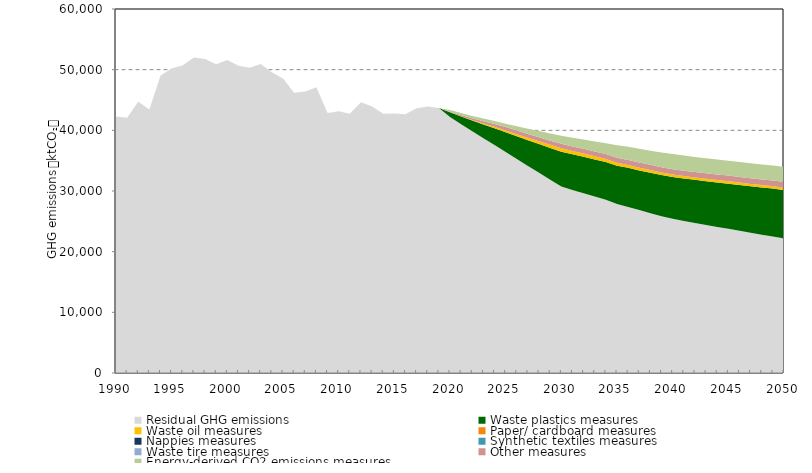
| Category | Residual GHG emissions | Waste plastics measures | Waste oil measures | Paper/ cardboard measures | Nappies measures | Synthetic textiles measures | Waste tire measures | Other measures | Energy-derived CO2 emissions measures |
|---|---|---|---|---|---|---|---|---|---|
| 1990.0 | 42266.328 | 0 | 0 | 0 | 0 | 0 | 0 | 0 | 0 |
| 1991.0 | 42068.039 | 0 | 0 | 0 | 0 | 0 | 0 | 0 | 0 |
| 1992.0 | 44731.649 | 0 | 0 | 0 | 0 | 0 | 0 | 0 | 0 |
| 1993.0 | 43428.344 | 0 | 0 | 0 | 0 | 0 | 0 | 0 | 0 |
| 1994.0 | 49054.209 | 0 | 0 | 0 | 0 | 0 | 0 | 0 | 0 |
| 1995.0 | 50185.134 | 0 | 0 | 0 | 0 | 0 | 0 | 0 | 0 |
| 1996.0 | 50738.328 | 0 | 0 | 0 | 0 | 0 | 0 | 0 | 0 |
| 1997.0 | 51995.071 | 0 | 0 | 0 | 0 | 0 | 0 | 0 | 0 |
| 1998.0 | 51748.919 | 0 | 0 | 0 | 0 | 0 | 0 | 0 | 0 |
| 1999.0 | 50913.17 | 0 | 0 | 0 | 0 | 0 | 0 | 0 | 0 |
| 2000.0 | 51605.471 | 0 | 0 | 0 | 0 | 0 | 0 | 0 | 0 |
| 2001.0 | 50655.519 | 0 | 0 | 0 | 0 | 0 | 0 | 0 | 0 |
| 2002.0 | 50310.327 | 0 | 0 | 0 | 0 | 0 | 0 | 0 | 0 |
| 2003.0 | 50923.046 | 0 | 0 | 0 | 0 | 0 | 0 | 0 | 0 |
| 2004.0 | 49561.224 | 0 | 0 | 0 | 0 | 0 | 0 | 0 | 0 |
| 2005.0 | 48535.509 | 0 | 0 | 0 | 0 | 0 | 0 | 0 | 0 |
| 2006.0 | 46186.191 | 0 | 0 | 0 | 0 | 0 | 0 | 0 | 0 |
| 2007.0 | 46417.888 | 0 | 0 | 0 | 0 | 0 | 0 | 0 | 0 |
| 2008.0 | 47090.333 | 0 | 0 | 0 | 0 | 0 | 0 | 0 | 0 |
| 2009.0 | 42840.145 | 0 | 0 | 0 | 0 | 0 | 0 | 0 | 0 |
| 2010.0 | 43141.105 | 0 | 0 | 0 | 0 | 0 | 0 | 0 | 0 |
| 2011.0 | 42732.48 | 0 | 0 | 0 | 0 | 0 | 0 | 0 | 0 |
| 2012.0 | 44630.65 | 0 | 0 | 0 | 0 | 0 | 0 | 0 | 0 |
| 2013.0 | 43911.198 | 0 | 0 | 0 | 0 | 0 | 0 | 0 | 0 |
| 2014.0 | 42717.865 | 0 | 0 | 0 | 0 | 0 | 0 | 0 | 0 |
| 2015.0 | 42794.468 | 0 | 0 | 0 | 0 | 0 | 0 | 0 | 0 |
| 2016.0 | 42653.672 | 0 | 0 | 0 | 0 | 0 | 0 | 0 | 0 |
| 2017.0 | 43637.786 | 0 | 0 | 0 | 0 | 0 | 0 | 0 | 0 |
| 2018.0 | 43948.194 | 0 | 0 | 0 | 0 | 0 | 0 | 0 | 0 |
| 2019.0 | 43693.849 | 0 | 0 | 0 | 0 | 0 | 0 | 0 | 0 |
| 2020.0 | 42217.498 | 758.817 | 2.814 | 0 | 0 | 0 | 0 | 90.971 | 267.931 |
| 2021.0 | 41017.494 | 1255.755 | 57.976 | 0 | 0 | 0 | 0 | 184.335 | 321.705 |
| 2022.0 | 39845.145 | 1764.288 | 113.09 | 0 | 0 | 0 | 0 | 278.646 | 377.282 |
| 2023.0 | 38688.611 | 2271.213 | 170.913 | 0 | 0 | 0 | 0 | 373.814 | 433.736 |
| 2024.0 | 37581.542 | 2777.884 | 225.93 | 0 | 0 | 0 | 0 | 469.398 | 487.854 |
| 2025.0 | 36414.085 | 3281.594 | 283.656 | 0 | 0 | 0 | 0 | 564.999 | 545.64 |
| 2026.0 | 35255.598 | 3771.278 | 338.575 | 0 | 0 | 0 | 0 | 597.932 | 712.208 |
| 2027.0 | 34106.794 | 4260.408 | 396.203 | 0 | 0 | 0 | 0 | 630.25 | 875.266 |
| 2028.0 | 33006.328 | 4750.106 | 451.025 | 0 | 0 | 0 | 0 | 662.032 | 1032.079 |
| 2029.0 | 31864.786 | 5236.711 | 505.799 | 0 | 0 | 0 | 0 | 693.435 | 1184.724 |
| 2030.0 | 30756.901 | 5724.145 | 563.281 | 0 | 0 | 0 | 0 | 724.431 | 1331.509 |
| 2031.0 | 30156.403 | 5897.896 | 547.318 | 0 | 0 | 0 | 0 | 743.648 | 1441.851 |
| 2032.0 | 29633.18 | 6023.629 | 531.307 | 0 | 0 | 0 | 0 | 762.708 | 1554.399 |
| 2033.0 | 29077.544 | 6127.114 | 515.249 | 0 | 0 | 0 | 0 | 781.561 | 1666.43 |
| 2034.0 | 28560.526 | 6224.341 | 499.143 | 0 | 0 | 0 | 0 | 800.214 | 1775.728 |
| 2035.0 | 27857.877 | 6318.837 | 482.99 | 0 | 0 | 0 | 0 | 818.432 | 2077.3 |
| 2036.0 | 27375.107 | 6439.875 | 466.789 | 0 | 0 | 0 | 0 | 835.937 | 2163.042 |
| 2037.0 | 26847.657 | 6552.028 | 450.541 | 0 | 0 | 0 | 0 | 851.258 | 2248.94 |
| 2038.0 | 26350.36 | 6664.38 | 434.245 | 0 | 0 | 0 | 0 | 864.641 | 2336.228 |
| 2039.0 | 25855.09 | 6775.503 | 417.902 | 0 | 0 | 0 | 0 | 876.374 | 2422.199 |
| 2040.0 | 25418.69 | 6887.661 | 401.511 | 0 | 0 | 0 | 0 | 886.701 | 2487.162 |
| 2041.0 | 25061.351 | 6995.595 | 402.17 | 0 | 0 | 0 | 0 | 895.88 | 2480.656 |
| 2042.0 | 24732.637 | 7105.954 | 402.825 | 0 | 0 | 0 | 0 | 903.917 | 2477.462 |
| 2043.0 | 24402.803 | 7216.033 | 403.476 | 0 | 0 | 0 | 0 | 910.985 | 2469.942 |
| 2044.0 | 24072.578 | 7325.944 | 404.122 | 0 | 0 | 0 | 0 | 917.201 | 2464.458 |
| 2045.0 | 23775.905 | 7437.487 | 404.765 | 0 | 0 | 0 | 0 | 922.697 | 2456.418 |
| 2046.0 | 23433.536 | 7544.751 | 405.402 | 0 | 0 | 0 | 0 | 927.525 | 2454.254 |
| 2047.0 | 23112.714 | 7654.706 | 406.036 | 0 | 0 | 0 | 0 | 931.724 | 2450.776 |
| 2048.0 | 22800.117 | 7764.419 | 406.666 | 0 | 0 | 0 | 0 | 935.397 | 2447.403 |
| 2049.0 | 22515.715 | 7875.812 | 407.291 | 0 | 0 | 0 | 0 | 938.629 | 2447.3 |
| 2050.0 | 22180.465 | 7982.62 | 407.912 | 0 | 0 | 0 | 0 | 941.432 | 2456.065 |